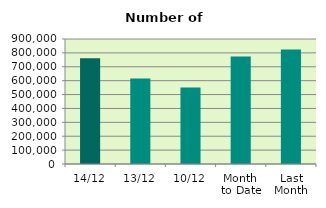
| Category | Series 0 |
|---|---|
| 14/12 | 761074 |
| 13/12 | 614890 |
| 10/12 | 550136 |
| Month 
to Date | 773102.6 |
| Last
Month | 823936.455 |